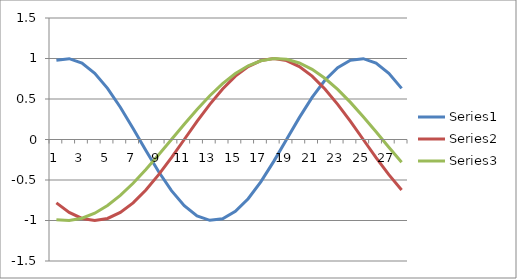
| Category | Series 0 | Series 1 | Series 2 |
|---|---|---|---|
| 0 | 0.979 | -0.782 | -0.99 |
| 1 | 0.998 | -0.901 | -0.999 |
| 2 | 0.942 | -0.975 | -0.972 |
| 3 | 0.817 | -1 | -0.91 |
| 4 | 0.631 | -0.975 | -0.815 |
| 5 | 0.398 | -0.901 | -0.69 |
| 6 | 0.136 | -0.782 | -0.541 |
| 7 | -0.136 | -0.623 | -0.372 |
| 8 | -0.398 | -0.434 | -0.189 |
| 9 | -0.631 | -0.223 | 0 |
| 10 | -0.817 | 0 | 0.189 |
| 11 | -0.942 | 0.223 | 0.372 |
| 12 | -0.998 | 0.434 | 0.541 |
| 13 | -0.979 | 0.623 | 0.69 |
| 14 | -0.888 | 0.782 | 0.815 |
| 15 | -0.731 | 0.901 | 0.91 |
| 16 | -0.52 | 0.975 | 0.972 |
| 17 | -0.27 | 1 | 0.999 |
| 18 | 0 | 0.975 | 0.99 |
| 19 | 0.27 | 0.901 | 0.945 |
| 20 | 0.52 | 0.782 | 0.866 |
| 21 | 0.731 | 0.623 | 0.756 |
| 22 | 0.888 | 0.434 | 0.618 |
| 23 | 0.979 | 0.223 | 0.458 |
| 24 | 0.998 | 0 | 0.282 |
| 25 | 0.942 | -0.223 | 0.095 |
| 26 | 0.817 | -0.434 | -0.095 |
| 27 | 0.631 | -0.623 | -0.282 |